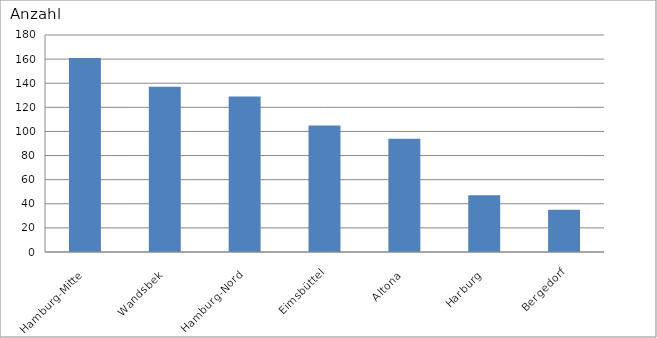
| Category | Hamburg-Mitte Wandsbek Hamburg-Nord Eimsbüttel Altona Harburg Bergedorf |
|---|---|
| Hamburg-Mitte | 161 |
| Wandsbek | 137 |
| Hamburg-Nord | 129 |
| Eimsbüttel | 105 |
| Altona | 94 |
| Harburg | 47 |
| Bergedorf | 35 |